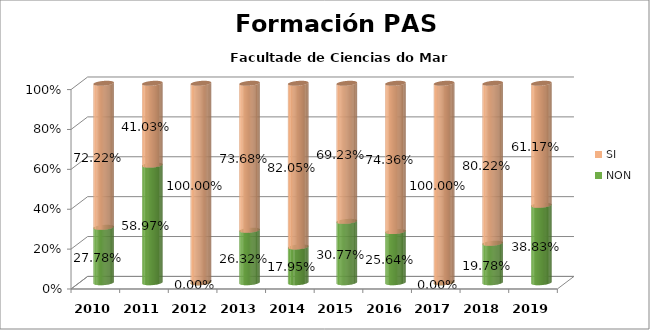
| Category | NON | SI |
|---|---|---|
| 2010.0 | 0.278 | 0.722 |
| 2011.0 | 0.59 | 0.41 |
| 2012.0 | 0 | 1 |
| 2013.0 | 0.263 | 0.737 |
| 2014.0 | 0.179 | 0.821 |
| 2015.0 | 0.308 | 0.692 |
| 2016.0 | 0.256 | 0.744 |
| 2017.0 | 0 | 1 |
| 2018.0 | 0.198 | 0.802 |
| 2019.0 | 0.388 | 0.612 |